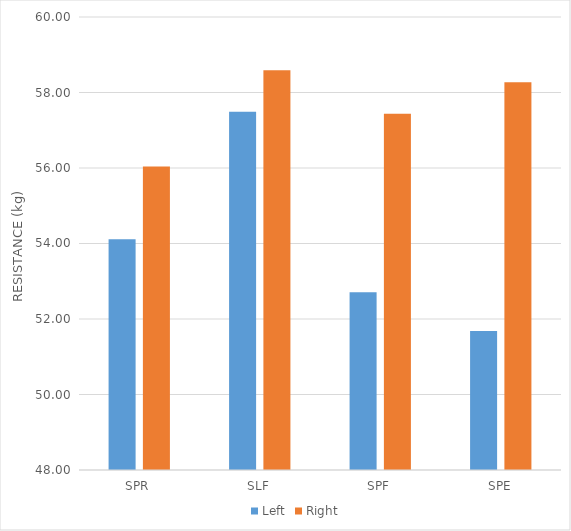
| Category | Left | Right |
|---|---|---|
| SPR | 54.11 | 56.04 |
| SLF | 57.49 | 58.59 |
| SPF | 52.71 | 57.44 |
| SPE | 51.68 | 58.27 |